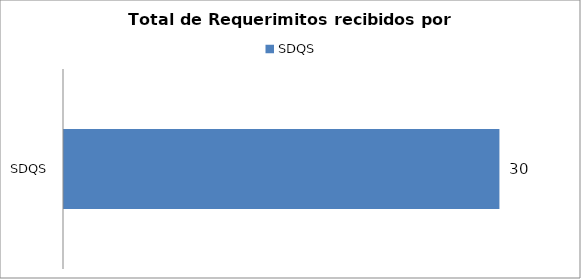
| Category | Total |
|---|---|
| SDQS | 30 |